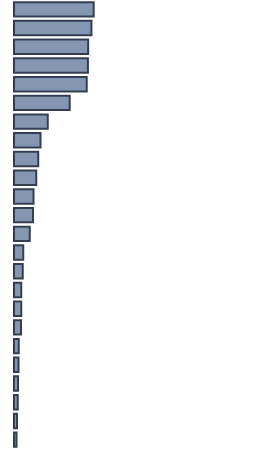
| Category | Percentatge |
|---|---|
| 0 | 33.2 |
| 1 | 32.261 |
| 2 | 30.9 |
| 3 | 30.8 |
| 4 | 30.3 |
| 5 | 23.2 |
| 6 | 14.043 |
| 7 | 11 |
| 8 | 10.1 |
| 9 | 9.3 |
| 10 | 8.1 |
| 11 | 7.957 |
| 12 | 6.6 |
| 13 | 3.9 |
| 14 | 3.6 |
| 15 | 3 |
| 16 | 3 |
| 17 | 2.9 |
| 18 | 2 |
| 19 | 1.9 |
| 20 | 1.7 |
| 21 | 1.6 |
| 22 | 1.3 |
| 23 | 1 |